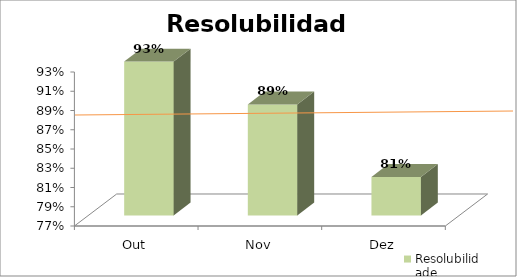
| Category | Resolubilidade |
|---|---|
| Out | 0.93 |
| Nov | 0.885 |
| Dez | 0.81 |